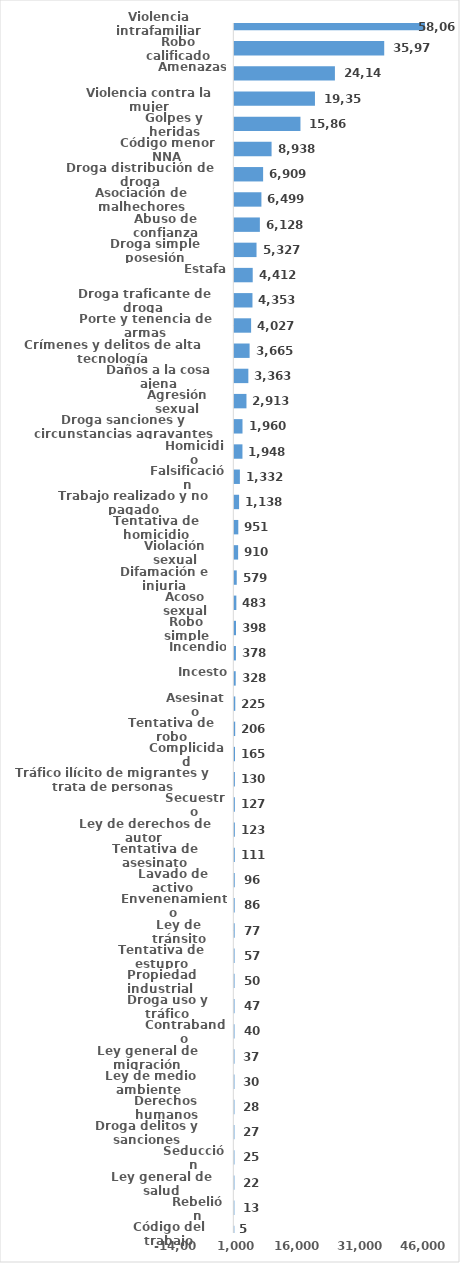
| Category | Series 0 |
|---|---|
| Violencia intrafamiliar | 58066 |
| Robo calificado | 35972 |
| Amenazas | 24140 |
| Violencia contra la mujer | 19350 |
| Golpes y heridas | 15869 |
| Código menor NNA | 8938 |
| Droga distribución de droga | 6909 |
| Asociación de malhechores | 6499 |
| Abuso de confianza | 6128 |
| Droga simple posesión | 5327 |
| Estafa | 4412 |
| Droga traficante de droga  | 4353 |
| Porte y tenencia de armas | 4027 |
| Crímenes y delitos de alta tecnología | 3665 |
| Daños a la cosa ajena | 3363 |
| Agresión sexual | 2913 |
| Droga sanciones y circunstancias agravantes | 1960 |
| Homicidio | 1948 |
| Falsificación | 1332 |
| Trabajo realizado y no pagado | 1138 |
| Tentativa de homicidio | 951 |
| Violación sexual | 910 |
| Difamación e injuria | 579 |
| Acoso sexual | 483 |
| Robo simple | 398 |
| Incendio | 378 |
| Incesto | 328 |
| Asesinato | 225 |
| Tentativa de robo | 206 |
| Complicidad | 165 |
| Tráfico ilícito de migrantes y trata de personas | 130 |
| Secuestro | 127 |
| Ley de derechos de autor  | 123 |
| Tentativa de asesinato | 111 |
| Lavado de activo | 96 |
| Envenenamiento | 86 |
| Ley de tránsito | 77 |
| Tentativa de estupro | 57 |
| Propiedad industrial  | 50 |
| Droga uso y tráfico | 47 |
| Contrabando | 40 |
| Ley general de migración | 37 |
| Ley de medio ambiente  | 30 |
| Derechos humanos | 28 |
| Droga delitos y sanciones | 27 |
| Seducción | 25 |
| Ley general de salud | 22 |
| Rebelión | 13 |
| Código del trabajo | 5 |